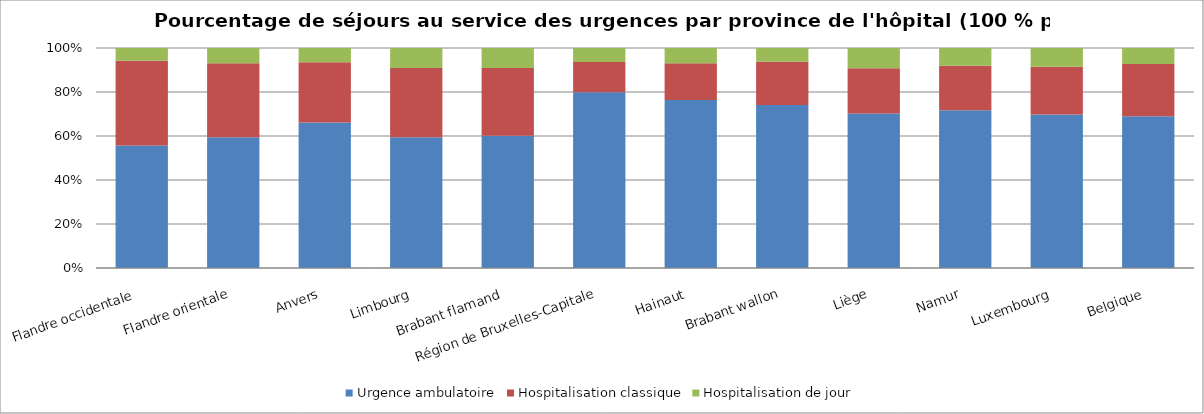
| Category | Urgence ambulatoire | Hospitalisation classique | Hospitalisation de jour |
|---|---|---|---|
| Flandre occidentale | 0.557 | 0.385 | 0.058 |
| Flandre orientale | 0.594 | 0.337 | 0.069 |
| Anvers | 0.661 | 0.274 | 0.064 |
| Limbourg | 0.594 | 0.316 | 0.09 |
| Brabant flamand | 0.601 | 0.307 | 0.091 |
| Région de Bruxelles-Capitale | 0.799 | 0.138 | 0.064 |
| Hainaut | 0.764 | 0.167 | 0.069 |
| Brabant wallon | 0.741 | 0.197 | 0.062 |
| Liège | 0.702 | 0.205 | 0.092 |
| Namur | 0.717 | 0.202 | 0.081 |
| Luxembourg | 0.697 | 0.217 | 0.085 |
| Belgique | 0.689 | 0.238 | 0.072 |